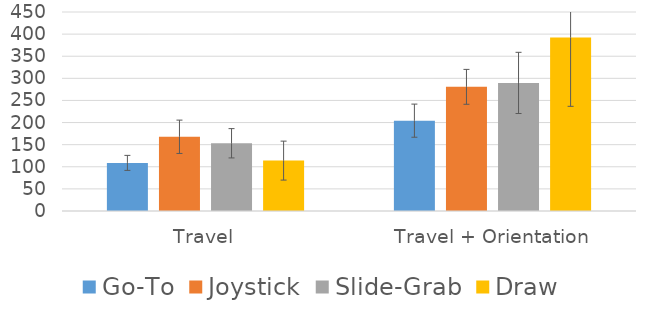
| Category | Go-To | Joystick | Slide-Grab | Draw |
|---|---|---|---|---|
| Travel | 108.806 | 167.831 | 153.164 | 113.949 |
| Travel + Orientation | 204.288 | 280.786 | 289.622 | 392.468 |